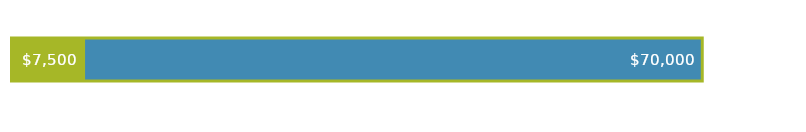
| Category | TOTAL FUNDING | TOTAL EXPENSES |
|---|---|---|
| 0 | 70000 | 7500 |